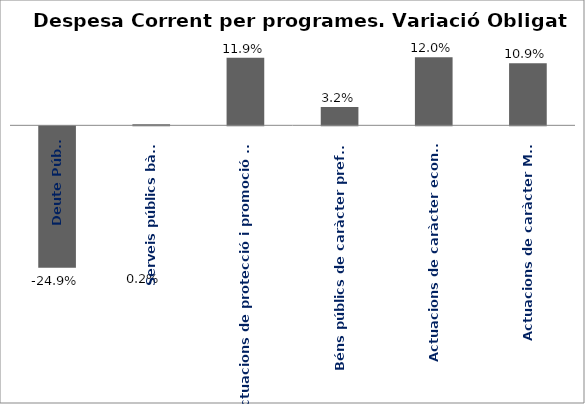
| Category | Series 0 |
|---|---|
| Deute Públic | -0.249 |
| Serveis públics bàsics | 0.002 |
| Actuacions de protecció i promoció social | 0.119 |
| Béns públics de caràcter preferent | 0.032 |
| Actuacions de caràcter econòmic | 0.12 |
| Actuacions de caràcter Marçal | 0.109 |